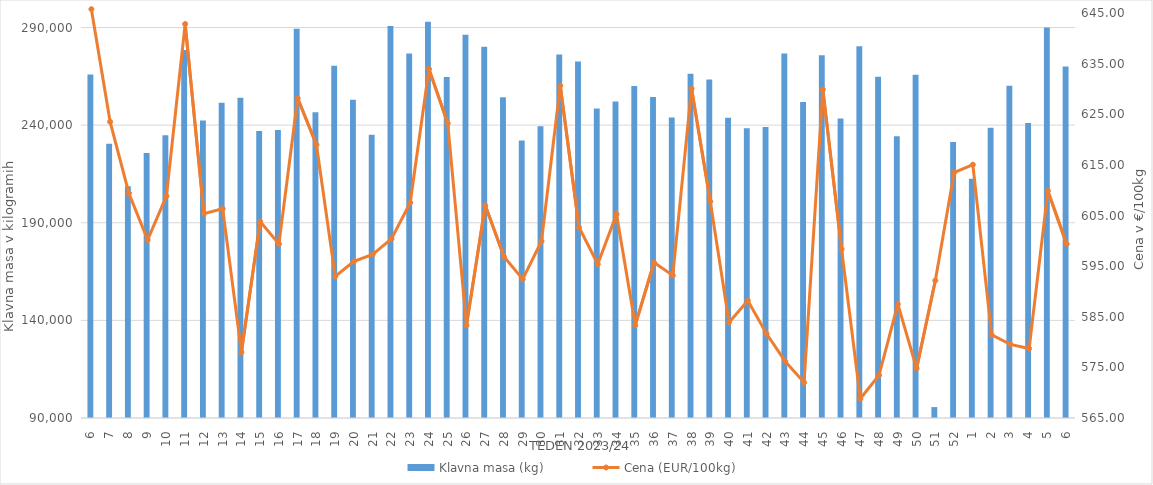
| Category | Klavna masa (kg) |
|---|---|
| 6.0 | 265944 |
| 7.0 | 230531 |
| 8.0 | 208699 |
| 9.0 | 225712 |
| 10.0 | 234762 |
| 11.0 | 278467 |
| 12.0 | 242369 |
| 13.0 | 251507 |
| 14.0 | 254072 |
| 15.0 | 236964 |
| 16.0 | 237552 |
| 17.0 | 289400 |
| 18.0 | 246616 |
| 19.0 | 270374 |
| 20.0 | 252984 |
| 21.0 | 235060 |
| 22.0 | 290816 |
| 23.0 | 276702 |
| 24.0 | 292976 |
| 25.0 | 264669 |
| 26.0 | 286237 |
| 27.0 | 280112 |
| 28.0 | 254336 |
| 29.0 | 232178 |
| 30.0 | 239437 |
| 31.0 | 276163 |
| 32.0 | 272647 |
| 33.0 | 248536 |
| 34.0 | 252050 |
| 35.0 | 260110 |
| 36.0 | 254389 |
| 37.0 | 243933 |
| 38.0 | 266321 |
| 39.0 | 263346 |
| 40.0 | 243765 |
| 41.0 | 238404 |
| 42.0 | 239007 |
| 43.0 | 276684 |
| 44.0 | 251832 |
| 45.0 | 275816 |
| 46.0 | 243425 |
| 47.0 | 280350 |
| 48.0 | 264849 |
| 49.0 | 234308 |
| 50.0 | 265786 |
| 51.0 | 95590 |
| 52.0 | 231370 |
| 1.0 | 212581 |
| 2.0 | 238607 |
| 3.0 | 260140 |
| 4.0 | 241148 |
| 5.0 | 290049 |
| 6.0 | 270025 |